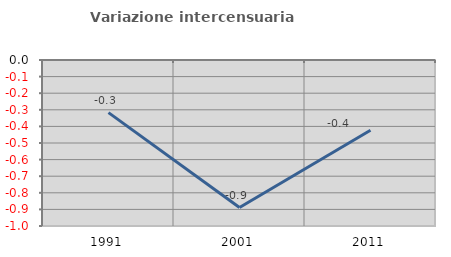
| Category | Variazione intercensuaria annua |
|---|---|
| 1991.0 | -0.317 |
| 2001.0 | -0.889 |
| 2011.0 | -0.423 |